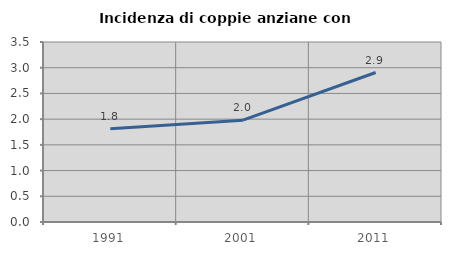
| Category | Incidenza di coppie anziane con figli |
|---|---|
| 1991.0 | 1.814 |
| 2001.0 | 1.981 |
| 2011.0 | 2.906 |